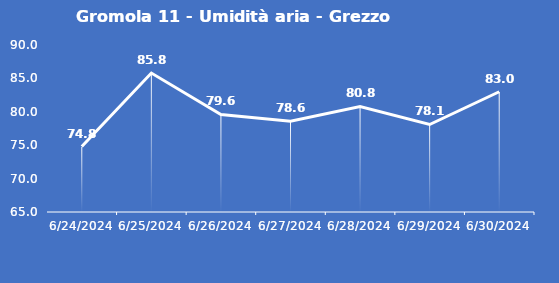
| Category | Gromola 11 - Umidità aria - Grezzo (%) |
|---|---|
| 6/24/24 | 74.8 |
| 6/25/24 | 85.8 |
| 6/26/24 | 79.6 |
| 6/27/24 | 78.6 |
| 6/28/24 | 80.8 |
| 6/29/24 | 78.1 |
| 6/30/24 | 83 |